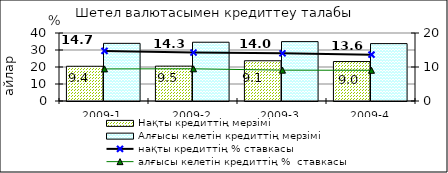
| Category | Нақты кредиттің мерзімі  | Алғысы келетін кредиттің мерзімі  |
|---|---|---|
| 2009-1 | 20.43 | 33.91 |
| 2009-2 | 20.51 | 34.57 |
| 2009-3 | 23.67 | 34.93 |
| 2009-4 | 23.21 | 33.76 |